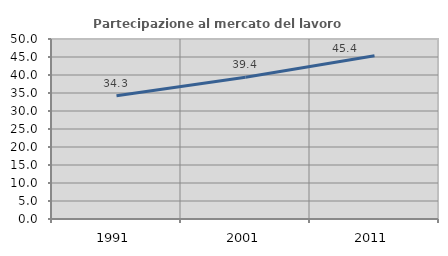
| Category | Partecipazione al mercato del lavoro  femminile |
|---|---|
| 1991.0 | 34.253 |
| 2001.0 | 39.358 |
| 2011.0 | 45.36 |